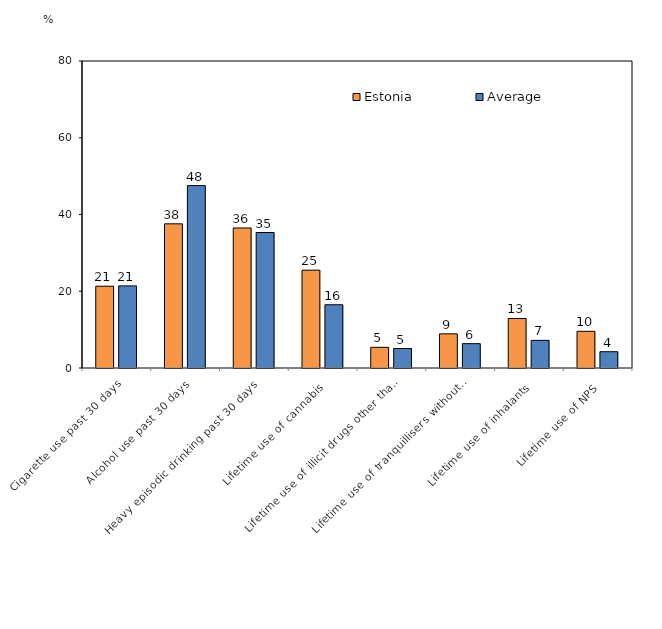
| Category | Estonia | Average |
|---|---|---|
| Cigarette use past 30 days | 21.31 | 21.397 |
| Alcohol use past 30 days | 37.57 | 47.531 |
| Heavy episodic drinking past 30 days | 36.49 | 35.309 |
| Lifetime use of cannabis | 25.49 | 16.48 |
| Lifetime use of illicit drugs other than cannabis | 5.39 | 5.079 |
| Lifetime use of tranquillisers without prescription  | 8.9 | 6.34 |
| Lifetime use of inhalants | 12.9 | 7.202 |
| Lifetime use of NPS | 9.56 | 4.246 |